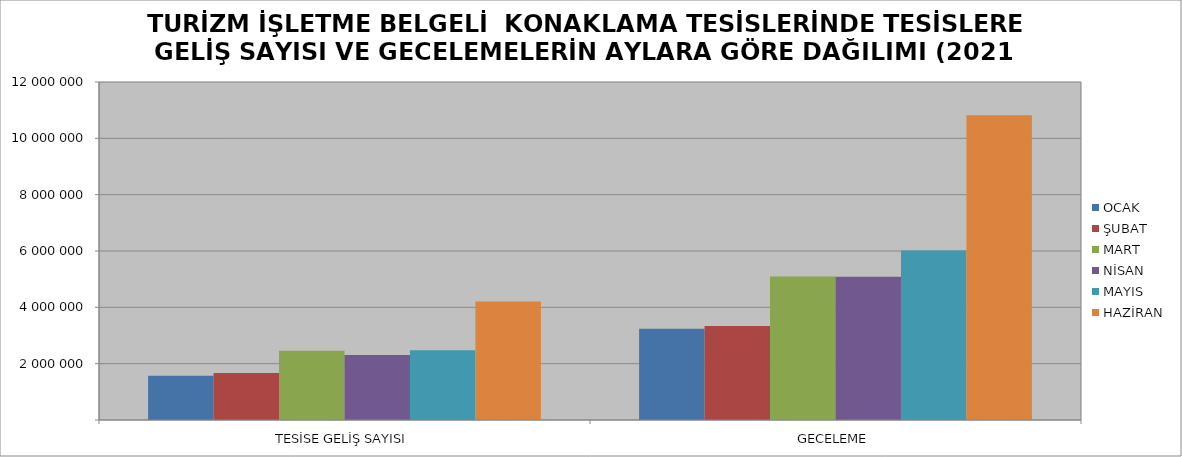
| Category | OCAK | ŞUBAT | MART | NİSAN | MAYIS | HAZİRAN |
|---|---|---|---|---|---|---|
| TESİSE GELİŞ SAYISI | 1571594 | 1670164 | 2462715 | 2305703 | 2480312 | 4203299 |
| GECELEME | 3239980 | 3333484 | 5094921 | 5081446 | 6019981 | 10819754 |